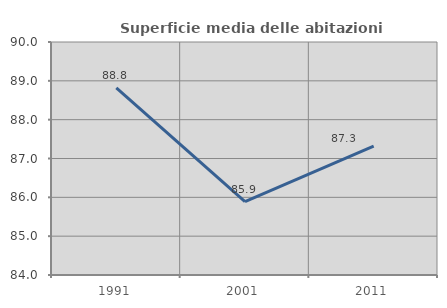
| Category | Superficie media delle abitazioni occupate |
|---|---|
| 1991.0 | 88.819 |
| 2001.0 | 85.887 |
| 2011.0 | 87.321 |